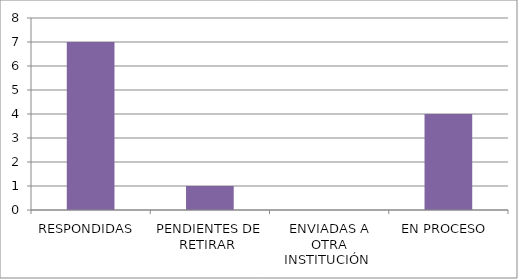
| Category | Series 0 |
|---|---|
| RESPONDIDAS  | 7 |
| PENDIENTES DE RETIRAR  | 1 |
| ENVIADAS A OTRA INSTITUCIÓN  | 0 |
| EN PROCESO  | 4 |